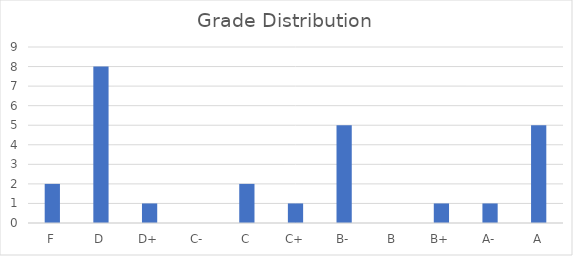
| Category | Series 0 |
|---|---|
| F | 2 |
| D | 8 |
| D+ | 1 |
| C- | 0 |
| C | 2 |
| C+ | 1 |
| B- | 5 |
| B | 0 |
| B+ | 1 |
| A- | 1 |
| A | 5 |